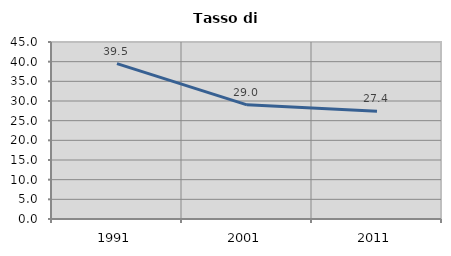
| Category | Tasso di disoccupazione   |
|---|---|
| 1991.0 | 39.518 |
| 2001.0 | 29.028 |
| 2011.0 | 27.386 |